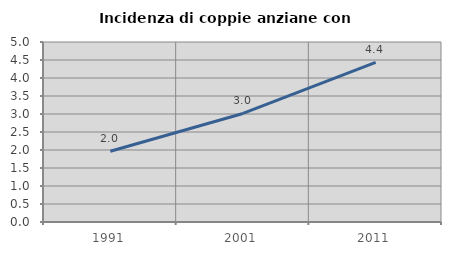
| Category | Incidenza di coppie anziane con figli |
|---|---|
| 1991.0 | 1.964 |
| 2001.0 | 3.015 |
| 2011.0 | 4.436 |